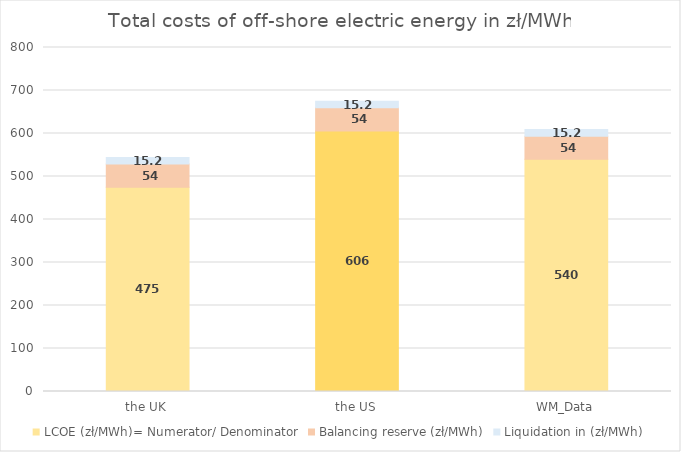
| Category | LCOE (zł/MWh)= Numerator/ Denominator | Balancing reserve (zł/MWh) | Liquidation in (zł/MWh) |
|---|---|---|---|
| the UK | 474.812 | 54 | 15.2 |
| the US | 605.767 | 54 | 15.2 |
| WM_Data | 539.834 | 54 | 15.2 |